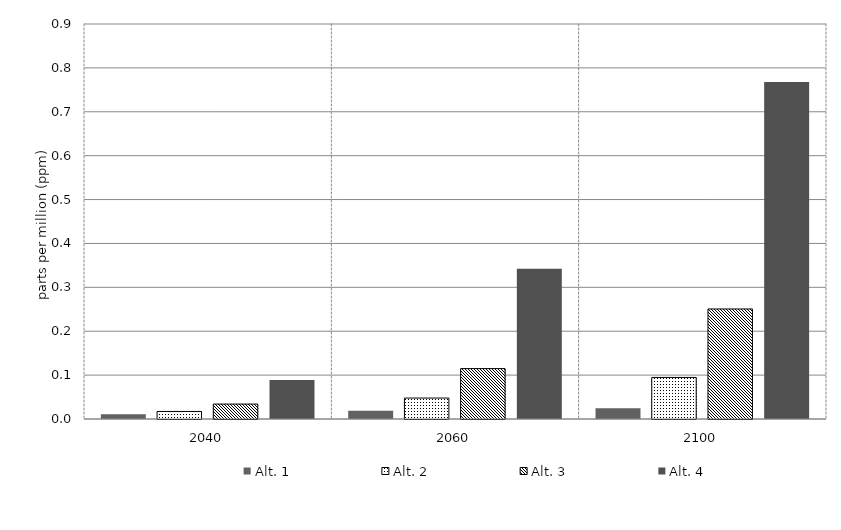
| Category | Alt. 1 | Alt. 2 | Alt. 3 | Alt. 4 | Alt 5 | Alt 6 | Alt 7 | Alt 8 | Alt 10 |
|---|---|---|---|---|---|---|---|---|---|
| 2040.0 | 0.011 | 0.017 | 0.034 | 0.089 |  |  |  |  |  |
| 2060.0 | 0.019 | 0.048 | 0.115 | 0.343 |  |  |  |  |  |
| 2100.0 | 0.024 | 0.095 | 0.251 | 0.768 |  |  |  |  |  |